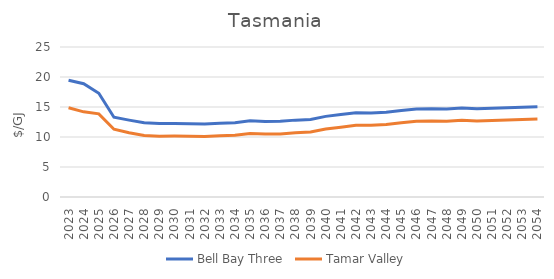
| Category | Bell Bay Three | Tamar Valley |
|---|---|---|
| 2023.0 | 19.467 | 14.866 |
| 2024.0 | 18.871 | 14.195 |
| 2025.0 | 17.283 | 13.853 |
| 2026.0 | 13.302 | 11.302 |
| 2027.0 | 12.813 | 10.713 |
| 2028.0 | 12.366 | 10.266 |
| 2029.0 | 12.237 | 10.137 |
| 2030.0 | 12.246 | 10.146 |
| 2031.0 | 12.211 | 10.111 |
| 2032.0 | 12.163 | 10.063 |
| 2033.0 | 12.307 | 10.207 |
| 2034.0 | 12.384 | 10.284 |
| 2035.0 | 12.692 | 10.592 |
| 2036.0 | 12.592 | 10.492 |
| 2037.0 | 12.608 | 10.508 |
| 2038.0 | 12.812 | 10.712 |
| 2039.0 | 12.928 | 10.828 |
| 2040.0 | 13.437 | 11.337 |
| 2041.0 | 13.739 | 11.639 |
| 2042.0 | 14.053 | 11.953 |
| 2043.0 | 13.998 | 11.948 |
| 2044.0 | 14.13 | 12.08 |
| 2045.0 | 14.422 | 12.372 |
| 2046.0 | 14.676 | 12.626 |
| 2047.0 | 14.709 | 12.659 |
| 2048.0 | 14.664 | 12.614 |
| 2049.0 | 14.833 | 12.783 |
| 2050.0 | 14.698 | 12.678 |
| 2051.0 | 14.781 | 12.761 |
| 2052.0 | 14.864 | 12.845 |
| 2053.0 | 14.948 | 12.929 |
| 2054.0 | 15.032 | 13.014 |